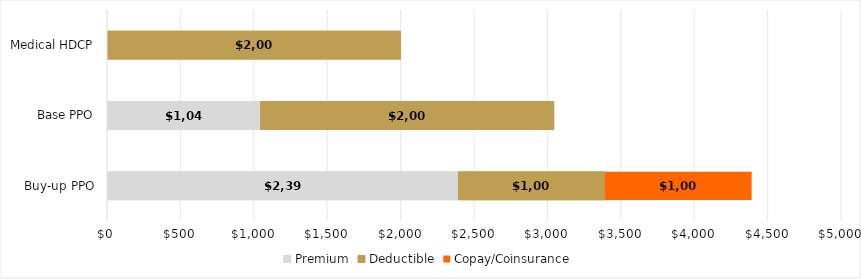
| Category | Premium | Deductible | Copay/Coinsurance |
|---|---|---|---|
| Buy-up PPO | 2391.36 | 1000 | 1000 |
| Base PPO | 1043.76 | 2000 | 0 |
| Medical HDCP | 0 | 2000 | 0 |